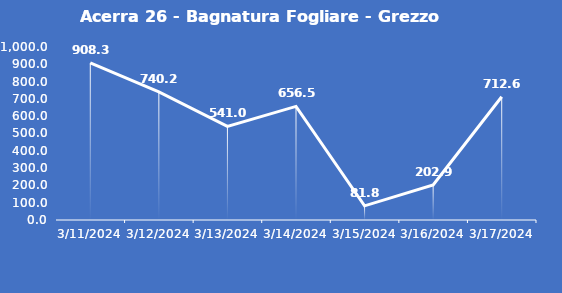
| Category | Acerra 26 - Bagnatura Fogliare - Grezzo (min) |
|---|---|
| 3/11/24 | 908.3 |
| 3/12/24 | 740.2 |
| 3/13/24 | 541 |
| 3/14/24 | 656.5 |
| 3/15/24 | 81.8 |
| 3/16/24 | 202.9 |
| 3/17/24 | 712.6 |